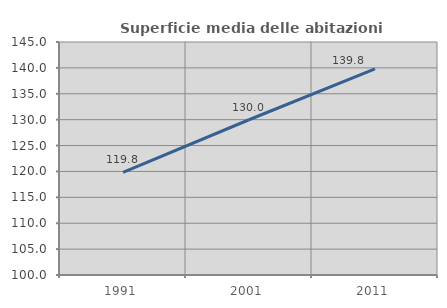
| Category | Superficie media delle abitazioni occupate |
|---|---|
| 1991.0 | 119.803 |
| 2001.0 | 129.983 |
| 2011.0 | 139.816 |